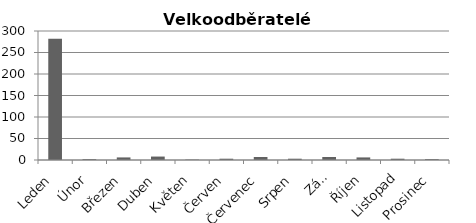
| Category | VO |
|---|---|
| Leden | 282 |
| Únor | 2 |
| Březen | 6 |
| Duben | 8 |
| Květen | 1 |
| Červen | 3 |
| Červenec | 7 |
| Srpen | 3 |
| Září | 7 |
| Říjen | 6 |
| Listopad | 3 |
| Prosinec | 2 |